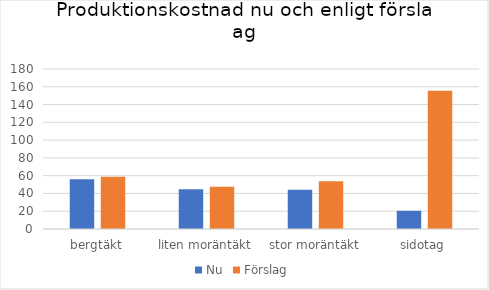
| Category | Nu | Förslag |
|---|---|---|
| bergtäkt | 55.907 | 58.864 |
| liten moräntäkt | 44.841 | 47.541 |
| stor moräntäkt | 44.147 | 53.714 |
| sidotag | 20.531 | 155.531 |